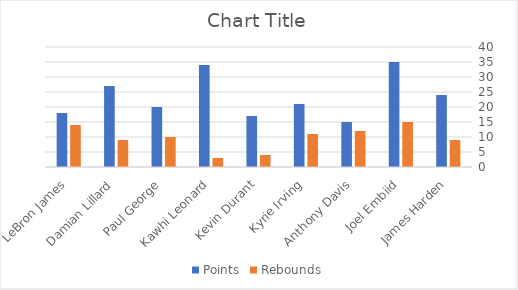
| Category | Points | Rebounds |
|---|---|---|
| LeBron James | 18 | 14 |
| Damian Lillard | 27 | 9 |
| Paul George | 20 | 10 |
| Kawhi Leonard | 34 | 3 |
| Kevin Durant | 17 | 4 |
| Kyrie Irving | 21 | 11 |
| Anthony Davis | 15 | 12 |
| Joel Embiid | 35 | 15 |
| James Harden | 24 | 9 |